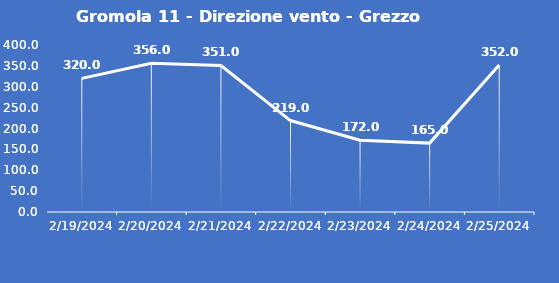
| Category | Gromola 11 - Direzione vento - Grezzo (°N) |
|---|---|
| 2/19/24 | 320 |
| 2/20/24 | 356 |
| 2/21/24 | 351 |
| 2/22/24 | 219 |
| 2/23/24 | 172 |
| 2/24/24 | 165 |
| 2/25/24 | 352 |